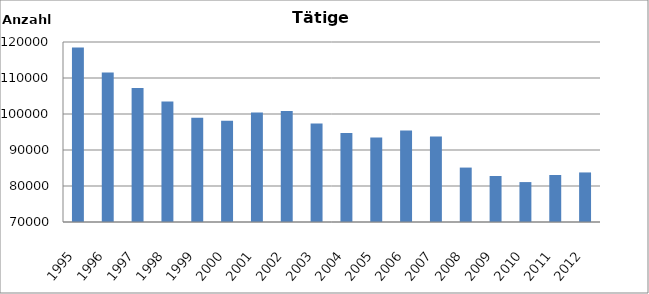
| Category | 1995 1996 1997 1998 1999 2000 2001 2002 2003 2004 2005 2006 2007 2008 2009 2010 2011 2012 |
|---|---|
| 1995 | 118464 |
| 1996 | 111544 |
| 1997 | 107253 |
| 1998 | 103463 |
| 1999 | 98926 |
| 2000 | 98154 |
| 2001 | 100422 |
| 2002 | 100868 |
| 2003 | 97367 |
| 2004 | 94725 |
| 2005 | 93496 |
| 2006 | 95427 |
| 2007 | 93755 |
| 2008 | 85118 |
| 2009 | 82782 |
| 2010 | 81089 |
| 2011 | 83058 |
| 2012 | 83766 |